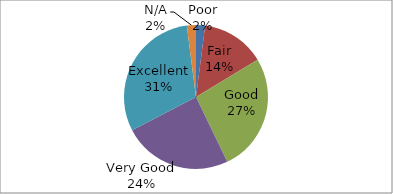
| Category | Series 0 |
|---|---|
| Poor | 1 |
| Fair | 7 |
| Good | 13 |
| Very Good | 12 |
| Excellent | 15 |
| N/A | 1 |